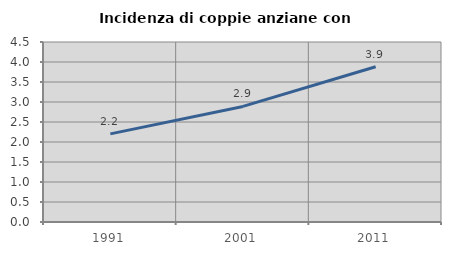
| Category | Incidenza di coppie anziane con figli |
|---|---|
| 1991.0 | 2.203 |
| 2001.0 | 2.89 |
| 2011.0 | 3.882 |